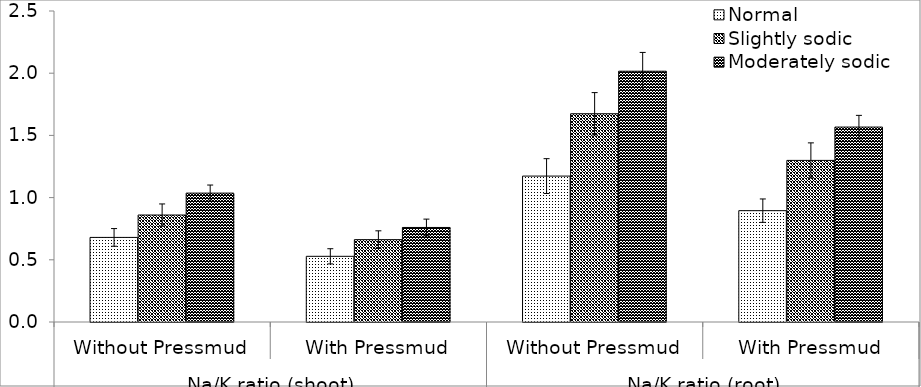
| Category | Normal | Slightly sodic | Moderately sodic |
|---|---|---|---|
| 0 | 0.68 | 0.86 | 1.036 |
| 1 | 0.528 | 0.662 | 0.76 |
| 2 | 1.173 | 1.674 | 2.016 |
| 3 | 0.895 | 1.299 | 1.567 |